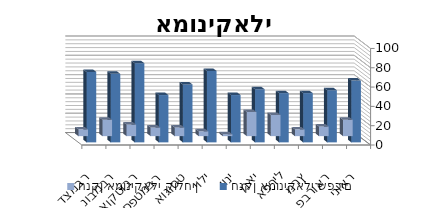
| Category | חנקן אמוניקאלי קולחין | חנקן אמוניקאלי שפכים |
|---|---|---|
| ינואר | 17 | 64 |
| פברואר | 10 | 54 |
| מרץ | 7 | 51 |
| אפריל | 22 | 51 |
| מאי | 25 | 55 |
| יוני | 2 | 49 |
| יולי | 5 | 74 |
| אוגוסט | 9 | 60 |
| ספטמבר | 9 | 49 |
| אוקטובר | 12 | 82 |
| נובמבר | 17 | 71 |
| דצמבר | 7 | 73 |